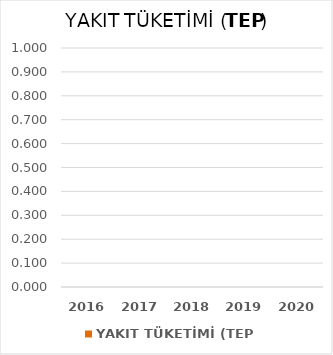
| Category | YAKIT TÜKETİMİ (TEP) | Series 1 |
|---|---|---|
| 2016.0 | 0 |  |
| 2017.0 | 0 |  |
| 2018.0 | 0 |  |
| 2019.0 | 0 |  |
| 2020.0 | 0 |  |